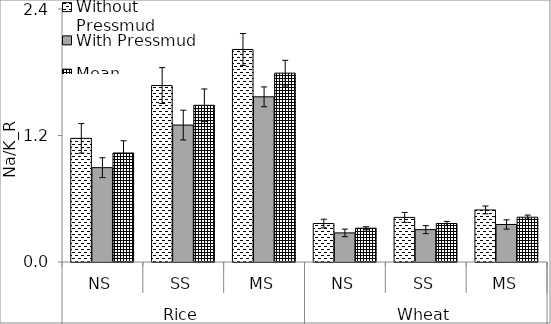
| Category | Without Pressmud | With Pressmud | Mean |
|---|---|---|---|
| 0 | 1.173 | 0.895 | 1.034 |
| 1 | 1.674 | 1.299 | 1.486 |
| 2 | 2.016 | 1.567 | 1.792 |
| 3 | 0.365 | 0.276 | 0.32 |
| 4 | 0.423 | 0.307 | 0.365 |
| 5 | 0.494 | 0.356 | 0.425 |